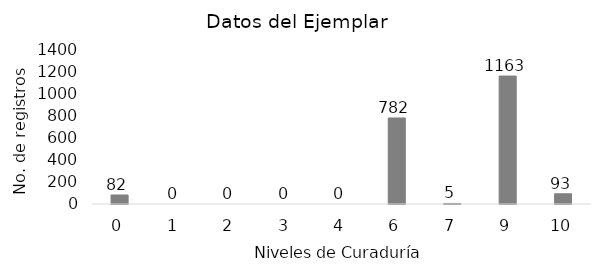
| Category | # de registros |
|---|---|
| 0.0 | 82 |
| 1.0 | 0 |
| 2.0 | 0 |
| 3.0 | 0 |
| 4.0 | 0 |
| 6.0 | 782 |
| 7.0 | 5 |
| 9.0 | 1163 |
| 10.0 | 93 |